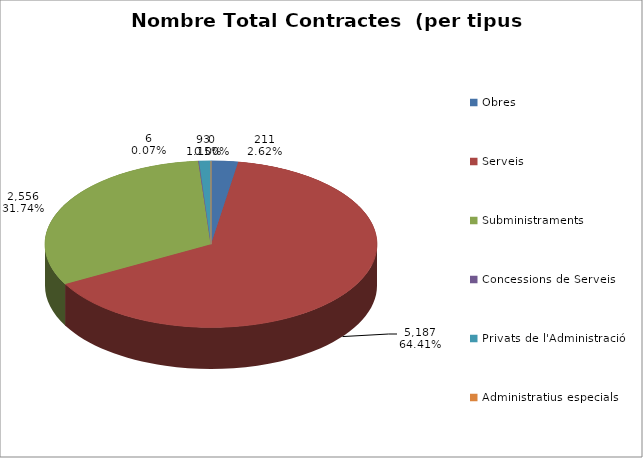
| Category | Nombre Total Contractes |
|---|---|
| Obres | 211 |
| Serveis | 5187 |
| Subministraments | 2556 |
| Concessions de Serveis | 6 |
| Privats de l'Administració | 93 |
| Administratius especials | 0 |